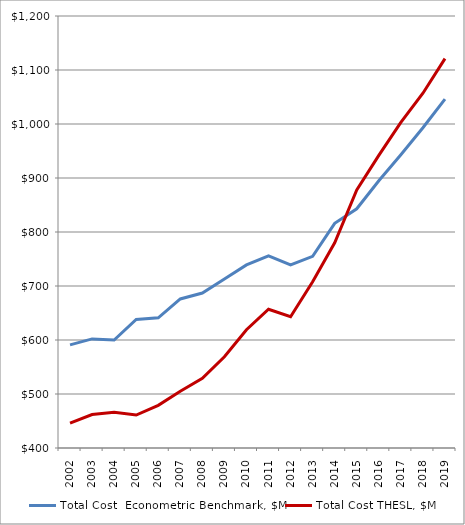
| Category | Total Cost  Econometric Benchmark, $M | Total Cost THESL, $M |
|---|---|---|
| 2002.0 | 591 | 446 |
| 2003.0 | 602 | 462 |
| 2004.0 | 600 | 466 |
| 2005.0 | 638 | 461 |
| 2006.0 | 641 | 479 |
| 2007.0 | 676 | 505 |
| 2008.0 | 687 | 529 |
| 2009.0 | 713 | 569 |
| 2010.0 | 739 | 619 |
| 2011.0 | 756 | 657 |
| 2012.0 | 739 | 643 |
| 2013.0 | 755 | 708 |
| 2014.0 | 816 | 780 |
| 2015.0 | 843 | 878 |
| 2016.0 | 895 | 942 |
| 2017.0 | 943 | 1003 |
| 2018.0 | 993 | 1057 |
| 2019.0 | 1046 | 1121 |